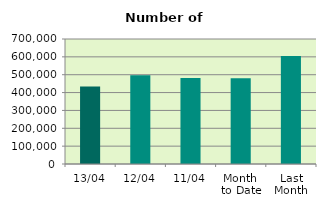
| Category | Series 0 |
|---|---|
| 13/04 | 434568 |
| 12/04 | 497132 |
| 11/04 | 481636 |
| Month 
to Date | 479553.143 |
| Last
Month | 605064 |